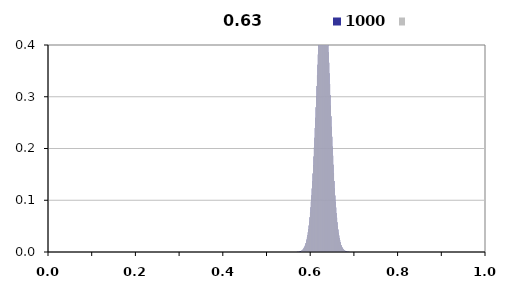
| Category | 1000 |
|---|---|
| 0.0 | -1 |
| 0.001 | -1 |
| 0.002 | -1 |
| 0.003 | -1 |
| 0.004 | -1 |
| 0.005 | -1 |
| 0.006 | -1 |
| 0.007 | -1 |
| 0.008 | -1 |
| 0.009 | -1 |
| 0.01 | -1 |
| 0.011 | -1 |
| 0.012 | -1 |
| 0.013 | -1 |
| 0.014 | -1 |
| 0.015 | -1 |
| 0.016 | -1 |
| 0.017 | -1 |
| 0.018 | -1 |
| 0.019 | -1 |
| 0.02 | -1 |
| 0.021 | -1 |
| 0.022 | -1 |
| 0.023 | -1 |
| 0.024 | -1 |
| 0.025 | -1 |
| 0.026 | -1 |
| 0.027 | -1 |
| 0.028 | -1 |
| 0.029 | -1 |
| 0.03 | -1 |
| 0.031 | -1 |
| 0.032 | -1 |
| 0.033 | -1 |
| 0.034 | -1 |
| 0.035 | -1 |
| 0.036 | -1 |
| 0.037 | -1 |
| 0.038 | -1 |
| 0.039 | -1 |
| 0.04 | -1 |
| 0.041 | -1 |
| 0.042 | -1 |
| 0.043 | -1 |
| 0.044 | -1 |
| 0.045 | -1 |
| 0.046 | -1 |
| 0.047 | -1 |
| 0.048 | -1 |
| 0.049 | -1 |
| 0.05 | -1 |
| 0.051 | -1 |
| 0.052 | -1 |
| 0.053 | -1 |
| 0.054 | -1 |
| 0.055 | -1 |
| 0.056 | -1 |
| 0.057 | -1 |
| 0.058 | -1 |
| 0.059 | -1 |
| 0.06 | -1 |
| 0.061 | -1 |
| 0.062 | -1 |
| 0.063 | -1 |
| 0.064 | -1 |
| 0.065 | -1 |
| 0.066 | -1 |
| 0.067 | -1 |
| 0.068 | -1 |
| 0.069 | -1 |
| 0.07 | -1 |
| 0.071 | -1 |
| 0.072 | -1 |
| 0.073 | -1 |
| 0.074 | -1 |
| 0.075 | -1 |
| 0.076 | -1 |
| 0.077 | -1 |
| 0.078 | -1 |
| 0.079 | -1 |
| 0.08 | -1 |
| 0.081 | -1 |
| 0.082 | -1 |
| 0.083 | -1 |
| 0.084 | -1 |
| 0.085 | -1 |
| 0.086 | -1 |
| 0.087 | -1 |
| 0.088 | -1 |
| 0.089 | -1 |
| 0.09 | -1 |
| 0.091 | -1 |
| 0.092 | -1 |
| 0.093 | -1 |
| 0.094 | -1 |
| 0.095 | -1 |
| 0.096 | -1 |
| 0.097 | -1 |
| 0.098 | -1 |
| 0.099 | -1 |
| 0.1 | -1 |
| 0.101 | -1 |
| 0.102 | -1 |
| 0.103 | -1 |
| 0.104 | -1 |
| 0.105 | -1 |
| 0.106 | -1 |
| 0.107 | -1 |
| 0.108 | -1 |
| 0.109 | -1 |
| 0.11 | -1 |
| 0.111 | -1 |
| 0.112 | -1 |
| 0.113 | -1 |
| 0.114 | -1 |
| 0.115 | -1 |
| 0.116 | -1 |
| 0.117 | -1 |
| 0.118 | -1 |
| 0.119 | -1 |
| 0.12 | -1 |
| 0.121 | -1 |
| 0.122 | -1 |
| 0.123 | -1 |
| 0.124 | -1 |
| 0.125 | -1 |
| 0.126 | -1 |
| 0.127 | -1 |
| 0.128 | -1 |
| 0.129 | -1 |
| 0.13 | -1 |
| 0.131 | -1 |
| 0.132 | -1 |
| 0.133 | -1 |
| 0.134 | -1 |
| 0.135 | -1 |
| 0.136 | -1 |
| 0.137 | -1 |
| 0.138 | -1 |
| 0.139 | -1 |
| 0.14 | -1 |
| 0.141 | -1 |
| 0.142 | -1 |
| 0.143 | -1 |
| 0.144 | -1 |
| 0.145 | -1 |
| 0.146 | -1 |
| 0.147 | -1 |
| 0.148 | -1 |
| 0.149 | -1 |
| 0.15 | -1 |
| 0.151 | -1 |
| 0.152 | -1 |
| 0.153 | -1 |
| 0.154 | -1 |
| 0.155 | -1 |
| 0.156 | -1 |
| 0.157 | -1 |
| 0.158 | -1 |
| 0.159 | -1 |
| 0.16 | -1 |
| 0.161 | -1 |
| 0.162 | -1 |
| 0.163 | -1 |
| 0.164 | -1 |
| 0.165 | -1 |
| 0.166 | -1 |
| 0.167 | -1 |
| 0.168 | -1 |
| 0.169 | -1 |
| 0.17 | -1 |
| 0.171 | -1 |
| 0.172 | -1 |
| 0.173 | -1 |
| 0.174 | -1 |
| 0.175 | -1 |
| 0.176 | -1 |
| 0.177 | -1 |
| 0.178 | -1 |
| 0.179 | -1 |
| 0.18 | -1 |
| 0.181 | -1 |
| 0.182 | -1 |
| 0.183 | -1 |
| 0.184 | -1 |
| 0.185 | -1 |
| 0.186 | -1 |
| 0.187 | -1 |
| 0.188 | -1 |
| 0.189 | -1 |
| 0.19 | -1 |
| 0.191 | -1 |
| 0.192 | -1 |
| 0.193 | -1 |
| 0.194 | -1 |
| 0.195 | -1 |
| 0.196 | -1 |
| 0.197 | -1 |
| 0.198 | -1 |
| 0.199 | -1 |
| 0.2 | -1 |
| 0.201 | -1 |
| 0.202 | -1 |
| 0.203 | -1 |
| 0.204 | -1 |
| 0.205 | -1 |
| 0.206 | -1 |
| 0.207 | -1 |
| 0.208 | -1 |
| 0.209 | -1 |
| 0.21 | -1 |
| 0.211 | -1 |
| 0.212 | -1 |
| 0.213 | -1 |
| 0.214 | -1 |
| 0.215 | -1 |
| 0.216 | -1 |
| 0.217 | -1 |
| 0.218 | -1 |
| 0.219 | -1 |
| 0.22 | -1 |
| 0.221 | -1 |
| 0.222 | -1 |
| 0.223 | -1 |
| 0.224 | -1 |
| 0.225 | -1 |
| 0.226 | -1 |
| 0.227 | -1 |
| 0.228 | -1 |
| 0.229 | -1 |
| 0.23 | -1 |
| 0.231 | -1 |
| 0.232 | -1 |
| 0.233 | -1 |
| 0.234 | -1 |
| 0.235 | -1 |
| 0.236 | -1 |
| 0.237 | -1 |
| 0.238 | -1 |
| 0.239 | -1 |
| 0.24 | -1 |
| 0.241 | -1 |
| 0.242 | -1 |
| 0.243 | -1 |
| 0.244 | -1 |
| 0.245 | -1 |
| 0.246 | -1 |
| 0.247 | -1 |
| 0.248 | -1 |
| 0.249 | -1 |
| 0.25 | -1 |
| 0.251 | -1 |
| 0.252 | -1 |
| 0.253 | -1 |
| 0.254 | -1 |
| 0.255 | -1 |
| 0.256 | -1 |
| 0.257 | -1 |
| 0.258 | -1 |
| 0.259 | -1 |
| 0.26 | -1 |
| 0.261 | -1 |
| 0.262 | -1 |
| 0.263 | -1 |
| 0.264 | -1 |
| 0.265 | -1 |
| 0.266 | -1 |
| 0.267 | -1 |
| 0.268 | -1 |
| 0.269 | -1 |
| 0.27 | -1 |
| 0.271 | -1 |
| 0.272 | -1 |
| 0.273 | -1 |
| 0.274 | -1 |
| 0.275 | -1 |
| 0.276 | -1 |
| 0.277 | -1 |
| 0.278 | -1 |
| 0.279 | -1 |
| 0.28 | -1 |
| 0.281 | -1 |
| 0.282 | -1 |
| 0.283 | -1 |
| 0.284 | -1 |
| 0.285 | -1 |
| 0.286 | -1 |
| 0.287 | -1 |
| 0.288 | -1 |
| 0.289 | -1 |
| 0.29 | -1 |
| 0.291 | -1 |
| 0.292 | -1 |
| 0.293 | -1 |
| 0.294 | -1 |
| 0.295 | -1 |
| 0.296 | -1 |
| 0.297 | -1 |
| 0.298 | -1 |
| 0.299 | -1 |
| 0.3 | -1 |
| 0.301 | -1 |
| 0.302 | -1 |
| 0.303 | -1 |
| 0.304 | -1 |
| 0.305 | -1 |
| 0.306 | -1 |
| 0.307 | -1 |
| 0.308 | -1 |
| 0.309 | -1 |
| 0.31 | -1 |
| 0.311 | -1 |
| 0.312 | -1 |
| 0.313 | -1 |
| 0.314 | -1 |
| 0.315 | -1 |
| 0.316 | -1 |
| 0.317 | -1 |
| 0.318 | -1 |
| 0.319 | -1 |
| 0.32 | -1 |
| 0.321 | -1 |
| 0.322 | -1 |
| 0.323 | -1 |
| 0.324 | -1 |
| 0.325 | -1 |
| 0.326 | -1 |
| 0.327 | -1 |
| 0.328 | -1 |
| 0.329 | -1 |
| 0.33 | -1 |
| 0.331 | -1 |
| 0.332 | -1 |
| 0.333 | -1 |
| 0.334 | -1 |
| 0.335 | -1 |
| 0.336 | -1 |
| 0.337 | -1 |
| 0.338 | -1 |
| 0.339 | -1 |
| 0.34 | -1 |
| 0.341 | -1 |
| 0.342 | -1 |
| 0.343 | -1 |
| 0.344 | -1 |
| 0.345 | -1 |
| 0.346 | -1 |
| 0.347 | -1 |
| 0.348 | -1 |
| 0.349 | -1 |
| 0.35 | -1 |
| 0.351 | -1 |
| 0.352 | -1 |
| 0.353 | -1 |
| 0.354 | -1 |
| 0.355 | -1 |
| 0.356 | -1 |
| 0.357 | -1 |
| 0.358 | -1 |
| 0.359 | -1 |
| 0.36 | -1 |
| 0.361 | -1 |
| 0.362 | -1 |
| 0.363 | -1 |
| 0.364 | -1 |
| 0.365 | -1 |
| 0.366 | -1 |
| 0.367 | -1 |
| 0.368 | -1 |
| 0.369 | -1 |
| 0.37 | -1 |
| 0.371 | -1 |
| 0.372 | -1 |
| 0.373 | -1 |
| 0.374 | -1 |
| 0.375 | -1 |
| 0.376 | -1 |
| 0.377 | -1 |
| 0.378 | -1 |
| 0.379 | -1 |
| 0.38 | -1 |
| 0.381 | -1 |
| 0.382 | -1 |
| 0.383 | -1 |
| 0.384 | -1 |
| 0.385 | -1 |
| 0.386 | -1 |
| 0.387 | -1 |
| 0.388 | -1 |
| 0.389 | -1 |
| 0.39 | -1 |
| 0.391 | -1 |
| 0.392 | -1 |
| 0.393 | -1 |
| 0.394 | -1 |
| 0.395 | -1 |
| 0.396 | -1 |
| 0.397 | -1 |
| 0.398 | -1 |
| 0.399 | -1 |
| 0.4 | -1 |
| 0.401 | -1 |
| 0.402 | -1 |
| 0.403 | -1 |
| 0.404 | -1 |
| 0.405 | -1 |
| 0.406 | -1 |
| 0.407 | -1 |
| 0.408 | -1 |
| 0.409 | -1 |
| 0.41 | -1 |
| 0.411 | -1 |
| 0.412 | -1 |
| 0.413 | -1 |
| 0.414 | -1 |
| 0.415 | -1 |
| 0.416 | -1 |
| 0.417 | -1 |
| 0.418 | -1 |
| 0.419 | -1 |
| 0.42 | -1 |
| 0.421 | -1 |
| 0.422 | -1 |
| 0.423 | -1 |
| 0.424 | -1 |
| 0.425 | -1 |
| 0.426 | -1 |
| 0.427 | -1 |
| 0.428 | -1 |
| 0.429 | -1 |
| 0.43 | -1 |
| 0.431 | -1 |
| 0.432 | -1 |
| 0.433 | -1 |
| 0.434 | -1 |
| 0.435 | -1 |
| 0.436 | -1 |
| 0.437 | -1 |
| 0.438 | -1 |
| 0.439 | -1 |
| 0.44 | -1 |
| 0.441 | -1 |
| 0.442 | -1 |
| 0.443 | -1 |
| 0.444 | -1 |
| 0.445 | -1 |
| 0.446 | -1 |
| 0.447 | -1 |
| 0.448 | -1 |
| 0.449 | -1 |
| 0.45 | -1 |
| 0.451 | -1 |
| 0.452 | -1 |
| 0.453 | -1 |
| 0.454 | -1 |
| 0.455 | -1 |
| 0.456 | -1 |
| 0.457 | -1 |
| 0.458 | -1 |
| 0.459 | -1 |
| 0.46 | -1 |
| 0.461 | -1 |
| 0.462 | -1 |
| 0.463 | -1 |
| 0.464 | -1 |
| 0.465 | -1 |
| 0.466 | -1 |
| 0.467 | -1 |
| 0.468 | -1 |
| 0.469 | -1 |
| 0.47 | -1 |
| 0.471 | -1 |
| 0.472 | -1 |
| 0.473 | -1 |
| 0.474 | -1 |
| 0.475 | -1 |
| 0.476 | -1 |
| 0.477 | -1 |
| 0.478 | -1 |
| 0.479 | -1 |
| 0.48 | -1 |
| 0.481 | -1 |
| 0.482 | -1 |
| 0.483 | -1 |
| 0.484 | -1 |
| 0.485 | -1 |
| 0.486 | -1 |
| 0.487 | -1 |
| 0.488 | -1 |
| 0.489 | -1 |
| 0.49 | -1 |
| 0.491 | -1 |
| 0.492 | -1 |
| 0.493 | -1 |
| 0.494 | -1 |
| 0.495 | -1 |
| 0.496 | -1 |
| 0.497 | -1 |
| 0.498 | -1 |
| 0.499 | -1 |
| 0.5 | -1 |
| 0.501 | -1 |
| 0.502 | -1 |
| 0.503 | -1 |
| 0.504 | -1 |
| 0.505 | -1 |
| 0.506 | -1 |
| 0.507 | -1 |
| 0.508 | -1 |
| 0.509 | -1 |
| 0.51 | -1 |
| 0.511 | -1 |
| 0.512 | -1 |
| 0.513 | -1 |
| 0.514 | -1 |
| 0.515 | -1 |
| 0.516 | -1 |
| 0.517 | -1 |
| 0.518 | -1 |
| 0.519 | -1 |
| 0.52 | -1 |
| 0.521 | -1 |
| 0.522 | -1 |
| 0.523 | -1 |
| 0.524 | -1 |
| 0.525 | -1 |
| 0.526 | -1 |
| 0.527 | -1 |
| 0.528 | -1 |
| 0.529 | -1 |
| 0.53 | -1 |
| 0.531 | -1 |
| 0.532 | -1 |
| 0.533 | -1 |
| 0.534 | -1 |
| 0.535 | -1 |
| 0.536 | -1 |
| 0.537 | -1 |
| 0.538 | -1 |
| 0.539 | -1 |
| 0.54 | -1 |
| 0.541 | -1 |
| 0.542 | -1 |
| 0.543 | -1 |
| 0.544 | -1 |
| 0.545 | -1 |
| 0.546 | -1 |
| 0.547 | -1 |
| 0.548 | -1 |
| 0.549 | -1 |
| 0.55 | -1 |
| 0.551 | -1 |
| 0.552 | -1 |
| 0.553 | -1 |
| 0.554 | -1 |
| 0.555 | -1 |
| 0.556 | -1 |
| 0.557 | -1 |
| 0.558 | -1 |
| 0.559 | -1 |
| 0.56 | -1 |
| 0.561 | -1 |
| 0.562 | -1 |
| 0.563 | -1 |
| 0.564 | -1 |
| 0.565 | -1 |
| 0.566 | -1 |
| 0.567 | -1 |
| 0.568 | -1 |
| 0.569 | -1 |
| 0.57 | -1 |
| 0.571 | -1 |
| 0.572 | -1 |
| 0.573 | -1 |
| 0.574 | -1 |
| 0.575 | -1 |
| 0.576 | -1 |
| 0.577 | -1 |
| 0.578 | -1 |
| 0.579 | -1 |
| 0.58 | 0.003 |
| 0.581 | 0.003 |
| 0.582 | 0.004 |
| 0.583 | 0.005 |
| 0.584 | 0.006 |
| 0.585 | 0.007 |
| 0.586 | 0.009 |
| 0.587 | 0.01 |
| 0.588 | 0.012 |
| 0.589 | 0.015 |
| 0.59 | 0.017 |
| 0.591 | 0.021 |
| 0.592 | 0.024 |
| 0.593 | 0.028 |
| 0.594 | 0.033 |
| 0.595 | 0.038 |
| 0.596 | 0.044 |
| 0.597 | 0.051 |
| 0.598 | 0.059 |
| 0.599 | 0.067 |
| 0.6 | 0.076 |
| 0.601 | 0.086 |
| 0.602 | 0.097 |
| 0.603 | 0.11 |
| 0.604 | 0.123 |
| 0.605 | 0.137 |
| 0.606 | 0.152 |
| 0.607 | 0.168 |
| 0.608 | 0.184 |
| 0.609 | 0.202 |
| 0.61 | 0.221 |
| 0.611 | 0.24 |
| 0.612 | 0.26 |
| 0.613 | 0.28 |
| 0.614 | 0.3 |
| 0.615 | 0.321 |
| 0.616 | 0.341 |
| 0.617 | 0.362 |
| 0.618 | 0.382 |
| 0.619 | 0.401 |
| 0.62 | 0.42 |
| 0.621 | 0.437 |
| 0.622 | 0.454 |
| 0.623 | 0.469 |
| 0.624 | 0.482 |
| 0.625 | 0.494 |
| 0.626 | 0.504 |
| 0.627 | 0.512 |
| 0.628 | 0.517 |
| 0.629 | 0.521 |
| 0.63 | 0.522 |
| 0.631 | 0.522 |
| 0.632 | 0.519 |
| 0.633 | 0.513 |
| 0.634 | 0.506 |
| 0.635 | 0.497 |
| 0.636 | 0.485 |
| 0.637 | 0.472 |
| 0.638 | 0.457 |
| 0.639 | 0.441 |
| 0.64 | 0.424 |
| 0.641 | 0.405 |
| 0.642 | 0.386 |
| 0.643 | 0.366 |
| 0.644 | 0.345 |
| 0.645 | 0.324 |
| 0.646 | 0.304 |
| 0.647 | 0.283 |
| 0.648 | 0.262 |
| 0.649 | 0.242 |
| 0.65 | 0.223 |
| 0.651 | 0.204 |
| 0.652 | 0.186 |
| 0.653 | 0.169 |
| 0.654 | 0.152 |
| 0.655 | 0.137 |
| 0.656 | 0.123 |
| 0.657 | 0.109 |
| 0.658 | 0.097 |
| 0.659 | 0.086 |
| 0.66 | 0.075 |
| 0.661 | 0.066 |
| 0.662 | 0.058 |
| 0.663 | 0.05 |
| 0.664 | 0.043 |
| 0.665 | 0.037 |
| 0.666 | 0.032 |
| 0.667 | 0.027 |
| 0.668 | 0.023 |
| 0.669 | 0.019 |
| 0.67 | 0.016 |
| 0.671 | 0.014 |
| 0.672 | 0.011 |
| 0.673 | 0.009 |
| 0.674 | 0.008 |
| 0.675 | 0.006 |
| 0.676 | 0.005 |
| 0.677 | 0.004 |
| 0.678 | 0.003 |
| 0.679 | 0.003 |
| 0.68 | 0.002 |
| 0.681 | -1 |
| 0.682 | -1 |
| 0.683 | -1 |
| 0.684 | -1 |
| 0.685 | -1 |
| 0.686 | -1 |
| 0.687 | -1 |
| 0.688 | -1 |
| 0.689 | -1 |
| 0.69 | -1 |
| 0.691 | -1 |
| 0.692 | -1 |
| 0.693 | -1 |
| 0.694 | -1 |
| 0.695 | -1 |
| 0.696 | -1 |
| 0.697 | -1 |
| 0.698 | -1 |
| 0.699 | -1 |
| 0.7 | -1 |
| 0.701 | -1 |
| 0.702 | -1 |
| 0.703 | -1 |
| 0.704 | -1 |
| 0.705 | -1 |
| 0.706 | -1 |
| 0.707 | -1 |
| 0.708 | -1 |
| 0.709 | -1 |
| 0.71 | -1 |
| 0.711 | -1 |
| 0.712 | -1 |
| 0.713 | -1 |
| 0.714 | -1 |
| 0.715 | -1 |
| 0.716 | -1 |
| 0.717 | -1 |
| 0.718 | -1 |
| 0.719 | -1 |
| 0.72 | -1 |
| 0.721 | -1 |
| 0.722 | -1 |
| 0.723 | -1 |
| 0.724 | -1 |
| 0.725 | -1 |
| 0.726 | -1 |
| 0.727 | -1 |
| 0.728 | -1 |
| 0.729 | -1 |
| 0.73 | -1 |
| 0.731 | -1 |
| 0.732 | -1 |
| 0.733 | -1 |
| 0.734 | -1 |
| 0.735 | -1 |
| 0.736 | -1 |
| 0.737 | -1 |
| 0.738 | -1 |
| 0.739 | -1 |
| 0.74 | -1 |
| 0.741 | -1 |
| 0.742 | -1 |
| 0.743 | -1 |
| 0.744 | -1 |
| 0.745 | -1 |
| 0.746 | -1 |
| 0.747 | -1 |
| 0.748 | -1 |
| 0.749 | -1 |
| 0.75 | -1 |
| 0.751 | -1 |
| 0.752 | -1 |
| 0.753 | -1 |
| 0.754 | -1 |
| 0.755 | -1 |
| 0.756 | -1 |
| 0.757 | -1 |
| 0.758 | -1 |
| 0.759 | -1 |
| 0.76 | -1 |
| 0.761 | -1 |
| 0.762 | -1 |
| 0.763 | -1 |
| 0.764 | -1 |
| 0.765 | -1 |
| 0.766 | -1 |
| 0.767 | -1 |
| 0.768 | -1 |
| 0.769 | -1 |
| 0.77 | -1 |
| 0.771 | -1 |
| 0.772 | -1 |
| 0.773 | -1 |
| 0.774 | -1 |
| 0.775 | -1 |
| 0.776 | -1 |
| 0.777 | -1 |
| 0.778 | -1 |
| 0.779 | -1 |
| 0.78 | -1 |
| 0.781 | -1 |
| 0.782 | -1 |
| 0.783 | -1 |
| 0.784 | -1 |
| 0.785 | -1 |
| 0.786 | -1 |
| 0.787 | -1 |
| 0.788 | -1 |
| 0.789 | -1 |
| 0.79 | -1 |
| 0.791 | -1 |
| 0.792 | -1 |
| 0.793 | -1 |
| 0.794 | -1 |
| 0.795 | -1 |
| 0.796 | -1 |
| 0.797 | -1 |
| 0.798 | -1 |
| 0.799 | -1 |
| 0.8 | -1 |
| 0.801 | -1 |
| 0.802 | -1 |
| 0.803 | -1 |
| 0.804 | -1 |
| 0.805 | -1 |
| 0.806 | -1 |
| 0.807 | -1 |
| 0.808 | -1 |
| 0.809 | -1 |
| 0.81 | -1 |
| 0.811 | -1 |
| 0.812 | -1 |
| 0.813 | -1 |
| 0.814 | -1 |
| 0.815 | -1 |
| 0.816 | -1 |
| 0.817 | -1 |
| 0.818 | -1 |
| 0.819 | -1 |
| 0.82 | -1 |
| 0.821 | -1 |
| 0.822 | -1 |
| 0.823 | -1 |
| 0.824 | -1 |
| 0.825 | -1 |
| 0.826 | -1 |
| 0.827 | -1 |
| 0.828 | -1 |
| 0.829 | -1 |
| 0.83 | -1 |
| 0.831 | -1 |
| 0.832 | -1 |
| 0.833 | -1 |
| 0.834 | -1 |
| 0.835 | -1 |
| 0.836 | -1 |
| 0.837 | -1 |
| 0.838 | -1 |
| 0.839 | -1 |
| 0.84 | -1 |
| 0.841 | -1 |
| 0.842 | -1 |
| 0.843 | -1 |
| 0.844 | -1 |
| 0.845 | -1 |
| 0.846 | -1 |
| 0.847 | -1 |
| 0.848 | -1 |
| 0.849 | -1 |
| 0.85 | -1 |
| 0.851 | -1 |
| 0.852 | -1 |
| 0.853 | -1 |
| 0.854 | -1 |
| 0.855 | -1 |
| 0.856 | -1 |
| 0.857 | -1 |
| 0.858 | -1 |
| 0.859 | -1 |
| 0.86 | -1 |
| 0.861 | -1 |
| 0.862 | -1 |
| 0.863 | -1 |
| 0.864 | -1 |
| 0.865 | -1 |
| 0.866 | -1 |
| 0.867 | -1 |
| 0.868 | -1 |
| 0.869 | -1 |
| 0.87 | -1 |
| 0.871 | -1 |
| 0.872 | -1 |
| 0.873 | -1 |
| 0.874 | -1 |
| 0.875 | -1 |
| 0.876 | -1 |
| 0.877 | -1 |
| 0.878 | -1 |
| 0.879 | -1 |
| 0.88 | -1 |
| 0.881 | -1 |
| 0.882 | -1 |
| 0.883 | -1 |
| 0.884 | -1 |
| 0.885 | -1 |
| 0.886 | -1 |
| 0.887 | -1 |
| 0.888 | -1 |
| 0.889 | -1 |
| 0.89 | -1 |
| 0.891 | -1 |
| 0.892 | -1 |
| 0.893 | -1 |
| 0.894 | -1 |
| 0.895 | -1 |
| 0.896 | -1 |
| 0.897 | -1 |
| 0.898 | -1 |
| 0.899 | -1 |
| 0.9 | -1 |
| 0.901 | -1 |
| 0.902 | -1 |
| 0.903 | -1 |
| 0.904 | -1 |
| 0.905 | -1 |
| 0.906 | -1 |
| 0.907 | -1 |
| 0.908 | -1 |
| 0.909 | -1 |
| 0.91 | -1 |
| 0.911 | -1 |
| 0.912 | -1 |
| 0.913 | -1 |
| 0.914 | -1 |
| 0.915 | -1 |
| 0.916 | -1 |
| 0.917 | -1 |
| 0.918 | -1 |
| 0.919 | -1 |
| 0.92 | -1 |
| 0.921 | -1 |
| 0.922 | -1 |
| 0.923 | -1 |
| 0.924 | -1 |
| 0.925 | -1 |
| 0.926 | -1 |
| 0.927 | -1 |
| 0.928 | -1 |
| 0.929 | -1 |
| 0.93 | -1 |
| 0.931 | -1 |
| 0.932 | -1 |
| 0.933 | -1 |
| 0.934 | -1 |
| 0.935 | -1 |
| 0.936 | -1 |
| 0.937 | -1 |
| 0.938 | -1 |
| 0.939 | -1 |
| 0.94 | -1 |
| 0.941 | -1 |
| 0.942 | -1 |
| 0.943 | -1 |
| 0.944 | -1 |
| 0.945 | -1 |
| 0.946 | -1 |
| 0.947 | -1 |
| 0.948 | -1 |
| 0.949 | -1 |
| 0.95 | -1 |
| 0.951 | -1 |
| 0.952 | -1 |
| 0.953 | -1 |
| 0.954 | -1 |
| 0.955 | -1 |
| 0.956 | -1 |
| 0.957 | -1 |
| 0.958 | -1 |
| 0.959 | -1 |
| 0.96 | -1 |
| 0.961 | -1 |
| 0.962 | -1 |
| 0.963 | -1 |
| 0.964 | -1 |
| 0.965 | -1 |
| 0.966 | -1 |
| 0.967 | -1 |
| 0.968 | -1 |
| 0.969 | -1 |
| 0.97 | -1 |
| 0.971 | -1 |
| 0.972 | -1 |
| 0.973 | -1 |
| 0.974 | -1 |
| 0.975 | -1 |
| 0.976 | -1 |
| 0.977 | -1 |
| 0.978 | -1 |
| 0.979 | -1 |
| 0.98 | -1 |
| 0.981 | -1 |
| 0.982 | -1 |
| 0.983 | -1 |
| 0.984 | -1 |
| 0.985 | -1 |
| 0.986 | -1 |
| 0.987 | -1 |
| 0.988 | -1 |
| 0.989 | -1 |
| 0.99 | -1 |
| 0.991 | -1 |
| 0.992 | -1 |
| 0.993 | -1 |
| 0.994 | -1 |
| 0.995 | -1 |
| 0.996 | -1 |
| 0.997 | -1 |
| 0.998 | -1 |
| 0.999 | -1 |
| 1.0 | -1 |